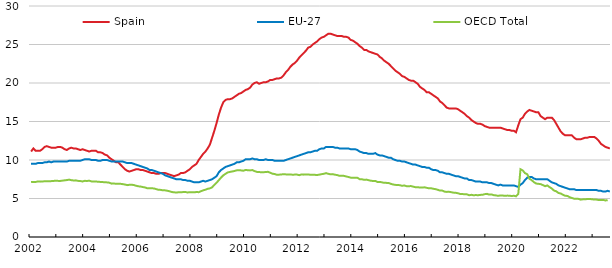
| Category | Spain | EU-27 | OECD Total |
|---|---|---|---|
| 2002.0 | 11.1 | 9.5 | 7.134 |
| nan | 11.5 | 9.5 | 7.144 |
| nan | 11.2 | 9.5 | 7.146 |
| nan | 11.2 | 9.6 | 7.215 |
| nan | 11.2 | 9.6 | 7.191 |
| nan | 11.4 | 9.6 | 7.21 |
| nan | 11.7 | 9.7 | 7.234 |
| nan | 11.8 | 9.7 | 7.255 |
| nan | 11.7 | 9.8 | 7.241 |
| nan | 11.6 | 9.7 | 7.255 |
| nan | 11.6 | 9.8 | 7.28 |
| nan | 11.6 | 9.8 | 7.31 |
| 2003.0 | 11.7 | 9.8 | 7.289 |
| nan | 11.7 | 9.8 | 7.282 |
| nan | 11.6 | 9.8 | 7.319 |
| nan | 11.4 | 9.8 | 7.359 |
| nan | 11.3 | 9.8 | 7.394 |
| nan | 11.5 | 9.9 | 7.453 |
| nan | 11.6 | 9.9 | 7.381 |
| nan | 11.5 | 9.9 | 7.342 |
| nan | 11.5 | 9.9 | 7.355 |
| nan | 11.4 | 9.9 | 7.291 |
| nan | 11.3 | 9.9 | 7.268 |
| nan | 11.4 | 10 | 7.214 |
| 2004.0 | 11.3 | 10.1 | 7.296 |
| nan | 11.2 | 10.1 | 7.274 |
| nan | 11.1 | 10.1 | 7.317 |
| nan | 11.2 | 10 | 7.218 |
| nan | 11.2 | 10 | 7.208 |
| nan | 11.2 | 10 | 7.201 |
| nan | 11 | 9.9 | 7.18 |
| nan | 11 | 9.9 | 7.15 |
| nan | 10.9 | 10 | 7.129 |
| nan | 10.7 | 10 | 7.117 |
| nan | 10.6 | 10 | 7.089 |
| nan | 10.3 | 9.9 | 7.054 |
| 2005.0 | 10.1 | 9.8 | 6.931 |
| nan | 9.9 | 9.8 | 6.952 |
| nan | 9.7 | 9.8 | 6.903 |
| nan | 9.7 | 9.8 | 6.924 |
| nan | 9.4 | 9.8 | 6.91 |
| nan | 9.1 | 9.8 | 6.864 |
| nan | 8.8 | 9.7 | 6.817 |
| nan | 8.6 | 9.6 | 6.737 |
| nan | 8.5 | 9.6 | 6.781 |
| nan | 8.6 | 9.6 | 6.787 |
| nan | 8.7 | 9.5 | 6.742 |
| nan | 8.8 | 9.4 | 6.651 |
| 2006.0 | 8.8 | 9.3 | 6.585 |
| nan | 8.7 | 9.2 | 6.548 |
| nan | 8.7 | 9.1 | 6.487 |
| nan | 8.6 | 9 | 6.434 |
| nan | 8.5 | 8.9 | 6.327 |
| nan | 8.4 | 8.7 | 6.341 |
| nan | 8.3 | 8.7 | 6.331 |
| nan | 8.3 | 8.6 | 6.303 |
| nan | 8.2 | 8.5 | 6.216 |
| nan | 8.2 | 8.4 | 6.131 |
| nan | 8.3 | 8.3 | 6.119 |
| nan | 8.3 | 8.2 | 6.057 |
| 2007.0 | 8.3 | 8 | 6.056 |
| nan | 8.2 | 7.9 | 6.002 |
| nan | 8.1 | 7.8 | 5.935 |
| nan | 8 | 7.7 | 5.841 |
| nan | 7.9 | 7.6 | 5.799 |
| nan | 8 | 7.5 | 5.782 |
| nan | 8.1 | 7.5 | 5.806 |
| nan | 8.3 | 7.5 | 5.807 |
| nan | 8.3 | 7.4 | 5.836 |
| nan | 8.4 | 7.4 | 5.849 |
| nan | 8.6 | 7.3 | 5.78 |
| nan | 8.8 | 7.3 | 5.825 |
| 2008.0 | 9.1 | 7.2 | 5.827 |
| nan | 9.3 | 7.1 | 5.799 |
| nan | 9.5 | 7.1 | 5.847 |
| nan | 10 | 7.1 | 5.819 |
| nan | 10.4 | 7.2 | 5.946 |
| nan | 10.8 | 7.3 | 6.057 |
| nan | 11.1 | 7.2 | 6.144 |
| nan | 11.5 | 7.3 | 6.256 |
| nan | 12 | 7.4 | 6.315 |
| nan | 12.9 | 7.5 | 6.456 |
| nan | 13.8 | 7.7 | 6.771 |
| nan | 14.8 | 7.9 | 7.052 |
| 2009.0 | 15.9 | 8.4 | 7.38 |
| nan | 16.8 | 8.7 | 7.717 |
| nan | 17.5 | 8.9 | 8.01 |
| nan | 17.8 | 9.1 | 8.205 |
| nan | 17.9 | 9.2 | 8.388 |
| nan | 17.9 | 9.3 | 8.452 |
| nan | 18 | 9.4 | 8.512 |
| nan | 18.2 | 9.5 | 8.574 |
| nan | 18.4 | 9.7 | 8.657 |
| nan | 18.6 | 9.7 | 8.679 |
| nan | 18.7 | 9.8 | 8.648 |
| nan | 18.9 | 9.9 | 8.606 |
| 2010.0 | 19.1 | 10.1 | 8.713 |
| nan | 19.2 | 10.1 | 8.671 |
| nan | 19.4 | 10.1 | 8.65 |
| nan | 19.8 | 10.2 | 8.697 |
| nan | 20 | 10.1 | 8.555 |
| nan | 20.1 | 10.1 | 8.458 |
| nan | 19.9 | 10 | 8.443 |
| nan | 20 | 10 | 8.402 |
| nan | 20.1 | 10 | 8.417 |
| nan | 20.1 | 10.1 | 8.436 |
| nan | 20.2 | 10 | 8.466 |
| nan | 20.4 | 10 | 8.346 |
| 2011.0 | 20.4 | 10 | 8.218 |
| nan | 20.5 | 9.9 | 8.178 |
| nan | 20.6 | 9.9 | 8.074 |
| nan | 20.6 | 9.9 | 8.096 |
| nan | 20.7 | 9.9 | 8.122 |
| nan | 21 | 9.9 | 8.157 |
| nan | 21.4 | 10 | 8.132 |
| nan | 21.7 | 10.1 | 8.106 |
| nan | 22.1 | 10.2 | 8.12 |
| nan | 22.4 | 10.3 | 8.09 |
| nan | 22.6 | 10.4 | 8.103 |
| nan | 22.9 | 10.5 | 8.1 |
| 2012.0 | 23.3 | 10.6 | 8.032 |
| nan | 23.6 | 10.7 | 8.125 |
| nan | 23.9 | 10.8 | 8.099 |
| nan | 24.2 | 10.9 | 8.121 |
| nan | 24.6 | 11 | 8.115 |
| nan | 24.7 | 11 | 8.086 |
| nan | 25 | 11.1 | 8.094 |
| nan | 25.2 | 11.2 | 8.073 |
| nan | 25.4 | 11.2 | 8.051 |
| nan | 25.7 | 11.4 | 8.098 |
| nan | 25.9 | 11.5 | 8.162 |
| nan | 26 | 11.5 | 8.206 |
| 2013.0 | 26.2 | 11.7 | 8.296 |
| nan | 26.4 | 11.7 | 8.204 |
| nan | 26.4 | 11.7 | 8.141 |
| nan | 26.3 | 11.7 | 8.165 |
| nan | 26.2 | 11.6 | 8.087 |
| nan | 26.1 | 11.6 | 8.041 |
| nan | 26.1 | 11.5 | 7.945 |
| nan | 26.1 | 11.5 | 7.966 |
| nan | 26 | 11.5 | 7.936 |
| nan | 26 | 11.5 | 7.861 |
| nan | 25.9 | 11.5 | 7.796 |
| nan | 25.6 | 11.4 | 7.71 |
| 2014.0 | 25.5 | 11.4 | 7.686 |
| nan | 25.3 | 11.4 | 7.699 |
| nan | 25.1 | 11.3 | 7.696 |
| nan | 24.8 | 11.1 | 7.515 |
| nan | 24.6 | 11 | 7.503 |
| nan | 24.3 | 10.9 | 7.424 |
| nan | 24.3 | 10.9 | 7.454 |
| nan | 24.1 | 10.8 | 7.38 |
| nan | 24 | 10.8 | 7.312 |
| nan | 23.9 | 10.8 | 7.274 |
| nan | 23.8 | 10.9 | 7.287 |
| nan | 23.7 | 10.7 | 7.145 |
| 2015.0 | 23.4 | 10.6 | 7.154 |
| nan | 23.2 | 10.6 | 7.099 |
| nan | 22.9 | 10.5 | 7.035 |
| nan | 22.7 | 10.4 | 7.029 |
| nan | 22.5 | 10.3 | 7.014 |
| nan | 22.2 | 10.3 | 6.902 |
| nan | 21.9 | 10.1 | 6.817 |
| nan | 21.6 | 10 | 6.77 |
| nan | 21.4 | 9.9 | 6.749 |
| nan | 21.2 | 9.9 | 6.732 |
| nan | 20.9 | 9.8 | 6.65 |
| nan | 20.8 | 9.8 | 6.689 |
| 2016.0 | 20.6 | 9.7 | 6.6 |
| nan | 20.4 | 9.6 | 6.597 |
| nan | 20.3 | 9.5 | 6.614 |
| nan | 20.3 | 9.4 | 6.535 |
| nan | 20.1 | 9.4 | 6.466 |
| nan | 19.9 | 9.3 | 6.469 |
| nan | 19.5 | 9.2 | 6.42 |
| nan | 19.3 | 9.1 | 6.432 |
| nan | 19.1 | 9.1 | 6.449 |
| nan | 18.8 | 9 | 6.39 |
| nan | 18.8 | 9 | 6.325 |
| nan | 18.6 | 8.8 | 6.335 |
| 2017.0 | 18.4 | 8.7 | 6.262 |
| nan | 18.2 | 8.7 | 6.215 |
| nan | 18 | 8.6 | 6.128 |
| nan | 17.6 | 8.4 | 6.027 |
| nan | 17.4 | 8.4 | 6.026 |
| nan | 17.1 | 8.3 | 5.895 |
| nan | 16.8 | 8.2 | 5.855 |
| nan | 16.7 | 8.2 | 5.873 |
| nan | 16.7 | 8.1 | 5.818 |
| nan | 16.7 | 8 | 5.763 |
| nan | 16.7 | 7.9 | 5.746 |
| nan | 16.6 | 7.9 | 5.68 |
| 2018.0 | 16.4 | 7.8 | 5.589 |
| nan | 16.2 | 7.7 | 5.583 |
| nan | 16 | 7.6 | 5.545 |
| nan | 15.7 | 7.6 | 5.542 |
| nan | 15.5 | 7.4 | 5.425 |
| nan | 15.2 | 7.4 | 5.478 |
| nan | 15 | 7.3 | 5.423 |
| nan | 14.8 | 7.2 | 5.447 |
| nan | 14.7 | 7.2 | 5.427 |
| nan | 14.7 | 7.2 | 5.468 |
| nan | 14.6 | 7.1 | 5.483 |
| nan | 14.4 | 7.1 | 5.563 |
| 2019.0 | 14.3 | 7.1 | 5.602 |
| nan | 14.2 | 7 | 5.505 |
| nan | 14.2 | 7 | 5.533 |
| nan | 14.2 | 6.9 | 5.435 |
| nan | 14.2 | 6.8 | 5.402 |
| nan | 14.2 | 6.7 | 5.343 |
| nan | 14.2 | 6.8 | 5.4 |
| nan | 14.1 | 6.7 | 5.384 |
| nan | 14 | 6.7 | 5.353 |
| nan | 13.9 | 6.7 | 5.375 |
| nan | 13.9 | 6.7 | 5.369 |
| nan | 13.8 | 6.7 | 5.32 |
| 2020.0 | 13.8 | 6.7 | 5.358 |
| nan | 13.6 | 6.6 | 5.284 |
| nan | 14.5 | 6.5 | 5.588 |
| nan | 15.3 | 6.8 | 8.798 |
| nan | 15.5 | 7 | 8.644 |
| nan | 16 | 7.4 | 8.297 |
| nan | 16.3 | 7.7 | 8.152 |
| nan | 16.5 | 7.8 | 7.564 |
| nan | 16.4 | 7.8 | 7.383 |
| nan | 16.3 | 7.6 | 7.127 |
| nan | 16.2 | 7.5 | 6.945 |
| nan | 16.2 | 7.5 | 6.907 |
| 2021.0 | 15.7 | 7.5 | 6.866 |
| nan | 15.5 | 7.5 | 6.743 |
| nan | 15.3 | 7.5 | 6.595 |
| nan | 15.5 | 7.5 | 6.697 |
| nan | 15.5 | 7.3 | 6.476 |
| nan | 15.5 | 7.1 | 6.3 |
| nan | 15.2 | 7 | 6.028 |
| nan | 14.7 | 6.9 | 5.937 |
| nan | 14.2 | 6.7 | 5.719 |
| nan | 13.7 | 6.6 | 5.649 |
| nan | 13.4 | 6.5 | 5.488 |
| nan | 13.2 | 6.4 | 5.353 |
| 2022.0 | 13.2 | 6.3 | 5.333 |
| nan | 13.2 | 6.2 | 5.169 |
| nan | 13.2 | 6.2 | 5.066 |
| nan | 12.9 | 6.2 | 4.974 |
| nan | 12.7 | 6.1 | 4.97 |
| nan | 12.7 | 6.1 | 4.949 |
| nan | 12.7 | 6.1 | 4.851 |
| nan | 12.8 | 6.1 | 4.899 |
| nan | 12.9 | 6.1 | 4.898 |
| nan | 12.9 | 6.1 | 4.944 |
| nan | 13 | 6.1 | 4.931 |
| nan | 13 | 6.1 | 4.906 |